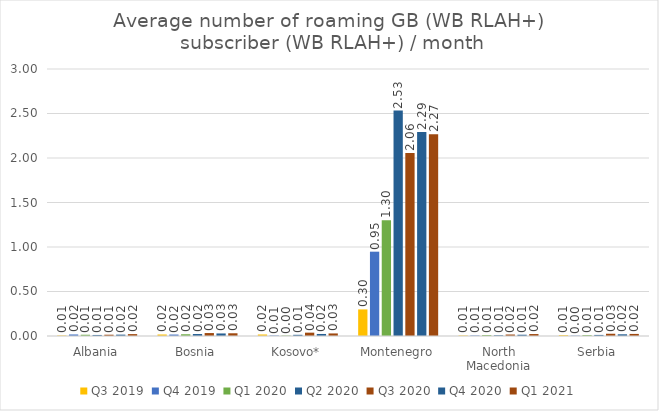
| Category | Q3 2019 | Q4 2019 | Q1 2020 | Q2 2020 | Q3 2020 | Q4 2020 | Q1 2021 |
|---|---|---|---|---|---|---|---|
| Albania | 0.006 | 0.017 | 0.014 | 0.012 | 0.014 | 0.015 | 0.021 |
| Bosnia | 0.017 | 0.016 | 0.02 | 0.022 | 0.033 | 0.029 | 0.031 |
| Kosovo* | 0.017 | 0.005 | 0.005 | 0.013 | 0.038 | 0.023 | 0.029 |
| Montenegro | 0.299 | 0.947 | 1.301 | 2.533 | 2.056 | 2.292 | 2.267 |
| North Macedonia | 0.006 | 0.006 | 0.011 | 0.008 | 0.017 | 0.014 | 0.022 |
| Serbia | 0.009 | 0.004 | 0.01 | 0.012 | 0.025 | 0.019 | 0.023 |